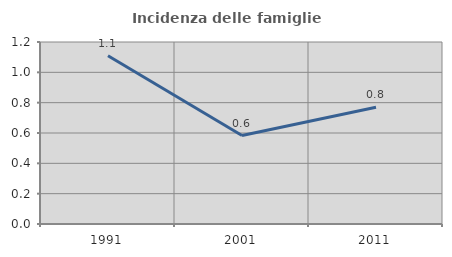
| Category | Incidenza delle famiglie numerose |
|---|---|
| 1991.0 | 1.109 |
| 2001.0 | 0.583 |
| 2011.0 | 0.77 |